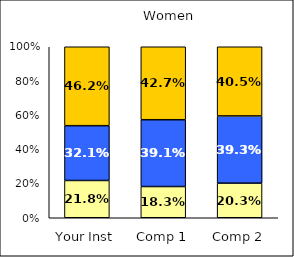
| Category | Low Positive Cross-Racial Interaction | Average Positive Cross-Racial Interaction | High Positive Cross-Racial Interaction |
|---|---|---|---|
| Your Inst | 0.218 | 0.321 | 0.462 |
| Comp 1 | 0.183 | 0.391 | 0.427 |
| Comp 2 | 0.203 | 0.393 | 0.405 |